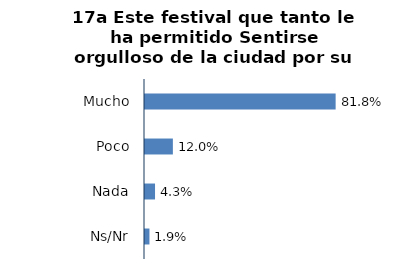
| Category | Series 0 |
|---|---|
| Mucho | 0.818 |
| Poco | 0.12 |
| Nada | 0.043 |
| Ns/Nr | 0.019 |